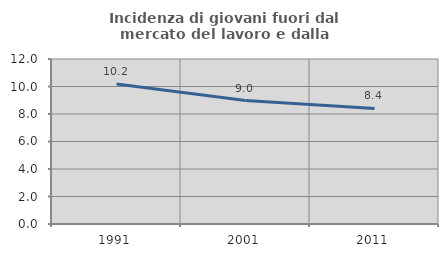
| Category | Incidenza di giovani fuori dal mercato del lavoro e dalla formazione  |
|---|---|
| 1991.0 | 10.189 |
| 2001.0 | 8.974 |
| 2011.0 | 8.403 |